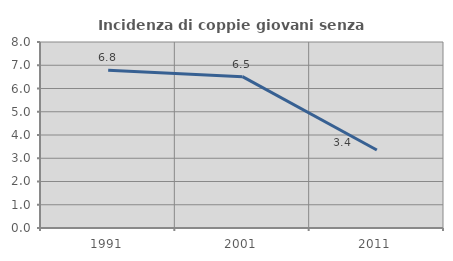
| Category | Incidenza di coppie giovani senza figli |
|---|---|
| 1991.0 | 6.79 |
| 2001.0 | 6.509 |
| 2011.0 | 3.356 |